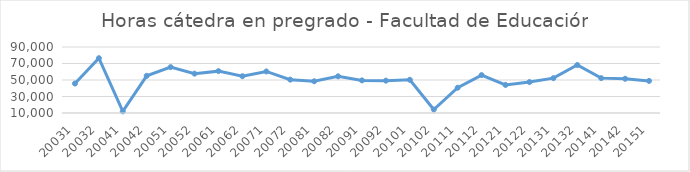
| Category | Total horas |
|---|---|
| 20031 | 45705 |
| 20032 | 76454 |
| 20041 | 11995 |
| 20042 | 55059 |
| 20051 | 65591 |
| 20052 | 57681 |
| 20061 | 60747 |
| 20062 | 54586 |
| 20071 | 60371 |
| 20072 | 50432 |
| 20081 | 48447 |
| 20082 | 54475 |
| 20091 | 49519 |
| 20092 | 49222 |
| 20101 | 50266 |
| 20102 | 14234 |
| 20111 | 40641 |
| 20112 | 55949 |
| 20121 | 44036 |
| 20122 | 47512 |
| 20131 | 52203 |
| 20132 | 68175 |
| 20141 | 52271 |
| 20142 | 51511 |
| 20151 | 48895 |